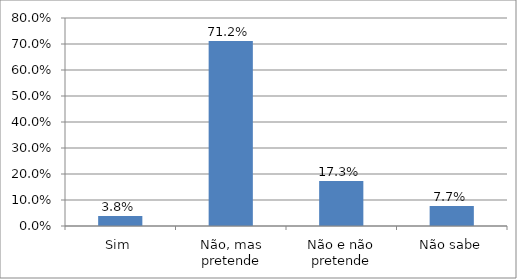
| Category | Series 0 |
|---|---|
| Sim | 0.038 |
| Não, mas pretende | 0.712 |
| Não e não pretende | 0.173 |
| Não sabe | 0.077 |